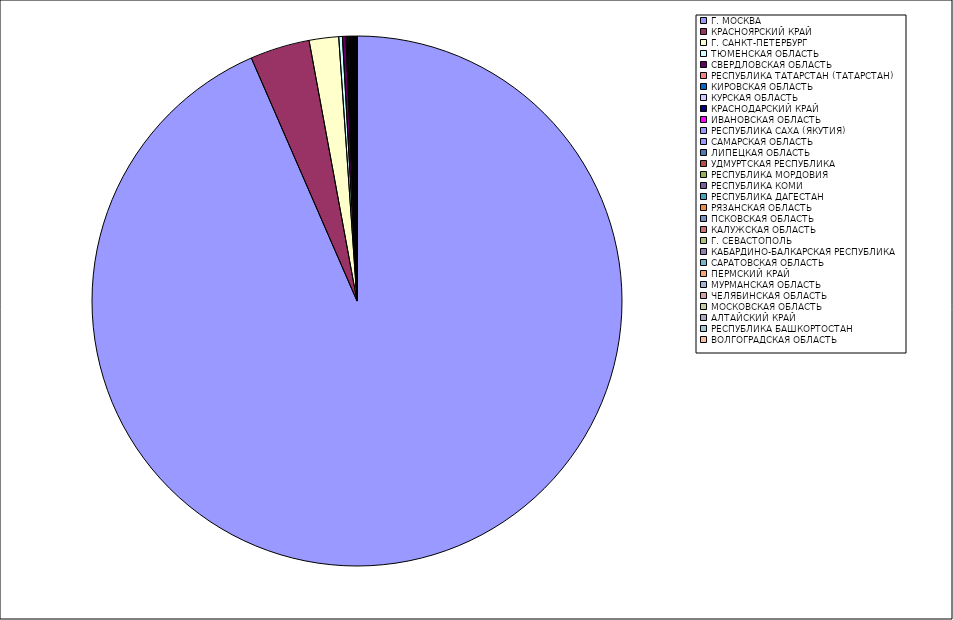
| Category | Оборот |
|---|---|
| Г. МОСКВА | 93.44 |
| КРАСНОЯРСКИЙ КРАЙ | 3.632 |
| Г. САНКТ-ПЕТЕРБУРГ | 1.794 |
| ТЮМЕНСКАЯ ОБЛАСТЬ | 0.223 |
| СВЕРДЛОВСКАЯ ОБЛАСТЬ | 0.21 |
| РЕСПУБЛИКА ТАТАРСТАН (ТАТАРСТАН) | 0.068 |
| КИРОВСКАЯ ОБЛАСТЬ | 0.067 |
| КУРСКАЯ ОБЛАСТЬ | 0.065 |
| КРАСНОДАРСКИЙ КРАЙ | 0.056 |
| ИВАНОВСКАЯ ОБЛАСТЬ | 0.047 |
| РЕСПУБЛИКА САХА (ЯКУТИЯ) | 0.041 |
| САМАРСКАЯ ОБЛАСТЬ | 0.039 |
| ЛИПЕЦКАЯ ОБЛАСТЬ | 0.035 |
| УДМУРТСКАЯ РЕСПУБЛИКА | 0.028 |
| РЕСПУБЛИКА МОРДОВИЯ | 0.024 |
| РЕСПУБЛИКА КОМИ | 0.024 |
| РЕСПУБЛИКА ДАГЕСТАН | 0.024 |
| РЯЗАНСКАЯ ОБЛАСТЬ | 0.017 |
| ПСКОВСКАЯ ОБЛАСТЬ | 0.017 |
| КАЛУЖСКАЯ ОБЛАСТЬ | 0.016 |
| Г. СЕВАСТОПОЛЬ | 0.015 |
| КАБАРДИНО-БАЛКАРСКАЯ РЕСПУБЛИКА | 0.015 |
| САРАТОВСКАЯ ОБЛАСТЬ | 0.012 |
| ПЕРМСКИЙ КРАЙ | 0.011 |
| МУРМАНСКАЯ ОБЛАСТЬ | 0.01 |
| ЧЕЛЯБИНСКАЯ ОБЛАСТЬ | 0.009 |
| МОСКОВСКАЯ ОБЛАСТЬ | 0.008 |
| АЛТАЙСКИЙ КРАЙ | 0.007 |
| РЕСПУБЛИКА БАШКОРТОСТАН | 0.007 |
| ВОЛГОГРАДСКАЯ ОБЛАСТЬ | 0.005 |